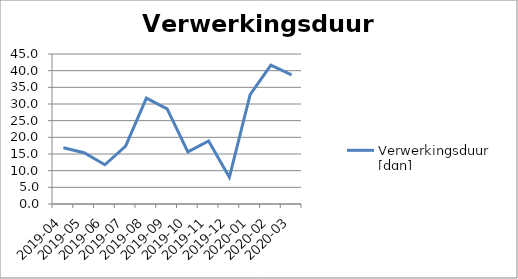
| Category | Verwerkingsduur [dgn] |
|---|---|
| 2019-04 | 16.879 |
| 2019-05 | 15.369 |
| 2019-06 | 11.77 |
| 2019-07 | 17.384 |
| 2019-08 | 31.77 |
| 2019-09 | 28.532 |
| 2019-10 | 15.631 |
| 2019-11 | 18.932 |
| 2019-12 | 8.022 |
| 2020-01 | 32.833 |
| 2020-02 | 41.654 |
| 2020-03 | 38.718 |